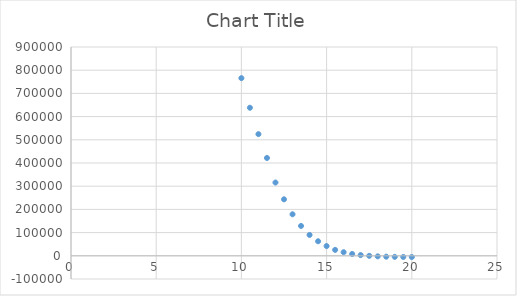
| Category | Series 0 |
|---|---|
| 20.0 | -5263.805 |
| 19.5 | -4949.18 |
| 19.0 | -4517.165 |
| 18.5 | -3763.57 |
| 18.0 | -2378.14 |
| 17.5 | -31.06 |
| 17.0 | 3158.845 |
| 16.5 | 7973.865 |
| 16.0 | 15429.525 |
| 15.5 | 25550.54 |
| 15.0 | 41971.82 |
| 14.5 | 62662.08 |
| 14.0 | 89883.2 |
| 13.5 | 128686.375 |
| 13.0 | 178908.92 |
| 12.5 | 243475.88 |
| 12.0 | 315859.365 |
| 11.5 | 421684.77 |
| 11.0 | 524431.595 |
| 10.5 | 638181.45 |
| 10.0 | 765756.17 |